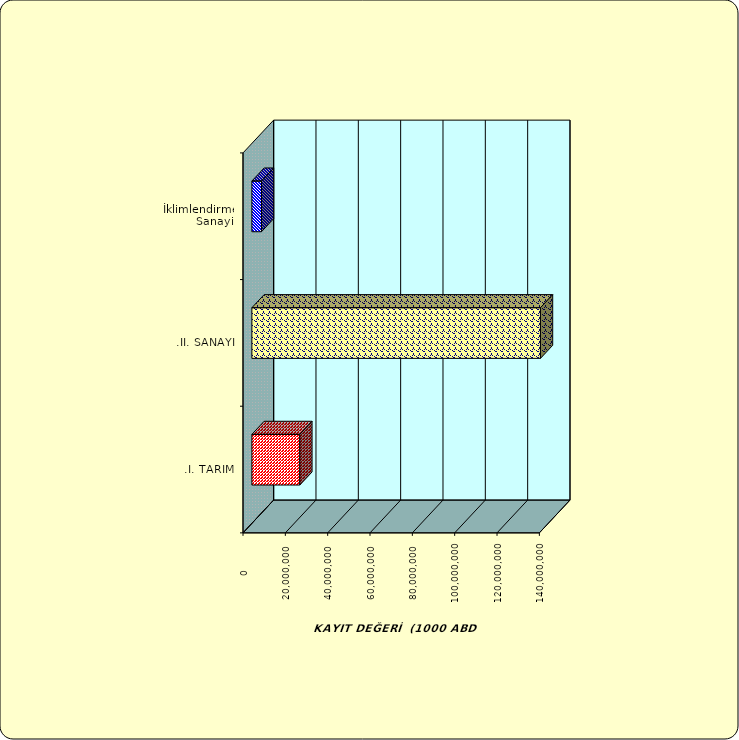
| Category | Series 0 |
|---|---|
| .I. TARIM | 22645609.135 |
| .II. SANAYİ | 136325297.419 |
|  İklimlendirme Sanayii | 4533720.596 |